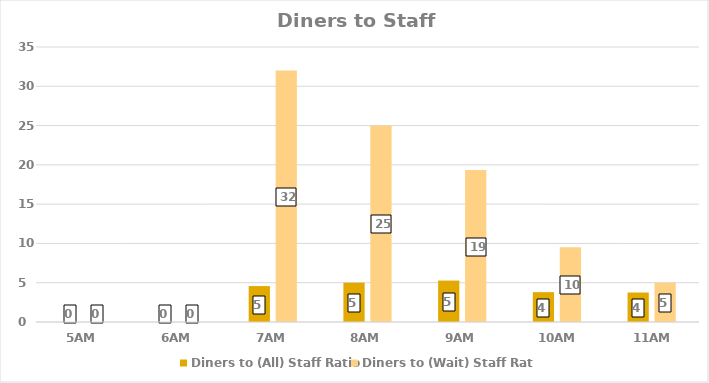
| Category | Diners to (All) Staff Ratio | Diners to (Wait) Staff Ratio |
|---|---|---|
| 5AM | 0 | 0 |
| 6AM | 0 | 0 |
| 7AM | 4.571 | 32 |
| 8AM | 5 | 25 |
| 9AM | 5.273 | 19.333 |
| 10AM | 3.8 | 9.5 |
| 11AM | 3.75 | 5 |